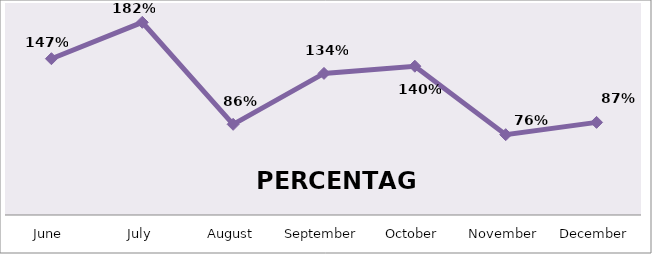
| Category | PERCENTAGE |
|---|---|
| June | 1.475 |
| July | 1.818 |
| August | 0.855 |
| September | 1.336 |
| October | 1.404 |
| November | 0.758 |
| December | 0.874 |